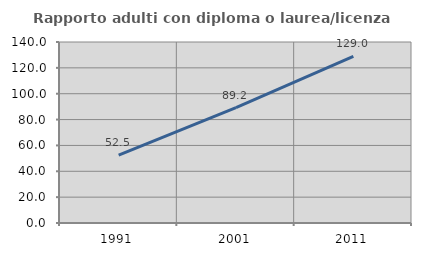
| Category | Rapporto adulti con diploma o laurea/licenza media  |
|---|---|
| 1991.0 | 52.487 |
| 2001.0 | 89.168 |
| 2011.0 | 128.97 |